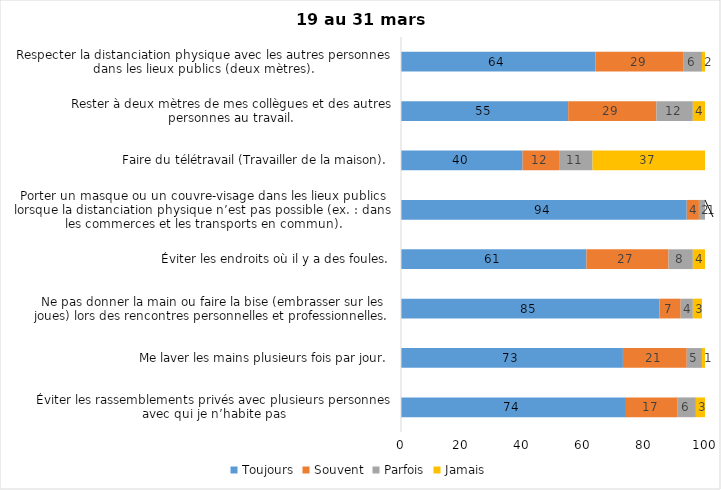
| Category | Toujours | Souvent | Parfois | Jamais |
|---|---|---|---|---|
| Éviter les rassemblements privés avec plusieurs personnes avec qui je n’habite pas | 74 | 17 | 6 | 3 |
| Me laver les mains plusieurs fois par jour. | 73 | 21 | 5 | 1 |
| Ne pas donner la main ou faire la bise (embrasser sur les joues) lors des rencontres personnelles et professionnelles. | 85 | 7 | 4 | 3 |
| Éviter les endroits où il y a des foules. | 61 | 27 | 8 | 4 |
| Porter un masque ou un couvre-visage dans les lieux publics lorsque la distanciation physique n’est pas possible (ex. : dans les commerces et les transports en commun). | 94 | 4 | 2 | 1 |
| Faire du télétravail (Travailler de la maison). | 40 | 12 | 11 | 37 |
| Rester à deux mètres de mes collègues et des autres personnes au travail. | 55 | 29 | 12 | 4 |
| Respecter la distanciation physique avec les autres personnes dans les lieux publics (deux mètres). | 64 | 29 | 6 | 2 |